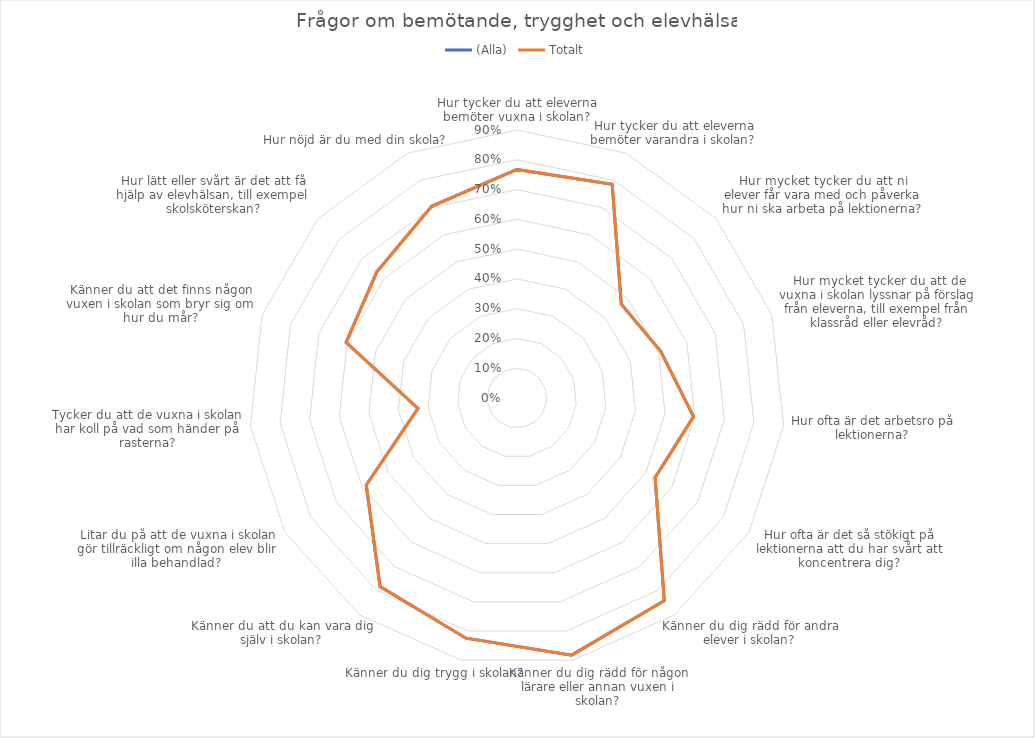
| Category | (Alla) | Totalt |
|---|---|---|
| Hur tycker du att eleverna bemöter vuxna i skolan? | 0.767 | 0.767 |
| Hur tycker du att eleverna bemöter varandra i skolan? | 0.786 | 0.786 |
| Hur mycket tycker du att ni elever får vara med och påverka hur ni ska arbeta på lektionerna? | 0.471 | 0.471 |
| Hur mycket tycker du att de vuxna i skolan lyssnar på förslag från eleverna, till exempel från klassråd eller elevråd? | 0.508 | 0.508 |
| Hur ofta är det arbetsro på lektionerna? | 0.596 | 0.596 |
| Hur ofta är det så stökigt på lektionerna att du har svårt att koncentrera dig? | 0.535 | 0.535 |
| Känner du dig rädd för andra elever i skolan? | 0.842 | 0.842 |
| Känner du dig rädd för någon lärare eller annan vuxen i skolan? | 0.883 | 0.883 |
| Känner du dig trygg i skolan? | 0.825 | 0.825 |
| Känner du att du kan vara dig själv i skolan? | 0.782 | 0.782 |
| Litar du på att de vuxna i skolan gör tillräckligt om någon elev blir illa behandlad? | 0.585 | 0.585 |
| Tycker du att de vuxna i skolan har koll på vad som händer på rasterna? | 0.334 | 0.334 |
| Känner du att det finns någon vuxen i skolan som bryr sig om hur du mår? | 0.604 | 0.604 |
| Hur lätt eller svårt är det att få hjälp av elevhälsan, till exempel skolsköterskan? | 0.633 | 0.633 |
| Hur nöjd är du med din skola? | 0.705 | 0.705 |